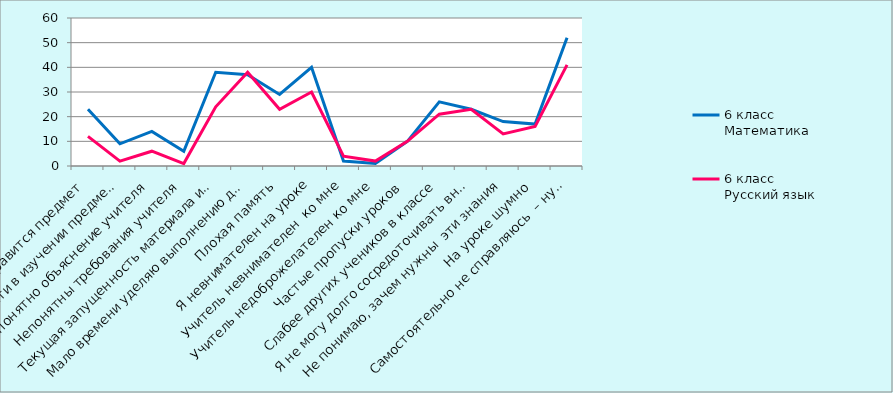
| Category | 6 класс Математика | 6 класс Русский язык |
|---|---|---|
| Не нравится предмет | 23 | 12 |
| Нет потребности в изучении предмета | 9 | 2 |
| Непонятно объяснение учителя | 14 | 6 |
| Непонятны требования учителя | 6 | 1 |
| Текущая запущенность материала из-за лени | 38 | 24 |
| Мало времени уделяю выполнению д/з | 37 | 38 |
| Плохая память | 29 | 23 |
| Я невнимателен на уроке | 40 | 30 |
| Учитель невнимателен  ко мне | 2 | 4 |
| Учитель недоброжелателен ко мне | 1 | 2 |
| Частые пропуски уроков | 10 | 10 |
| Слабее других учеников в классе | 26 | 21 |
| Я не могу долго сосредоточивать внимание | 23 | 23 |
| Не понимаю, зачем нужны  эти знания | 18 | 13 |
| На уроке шумно | 17 | 16 |
| Самостоятельно не справляюсь  – нужна помощь  | 52 | 41 |